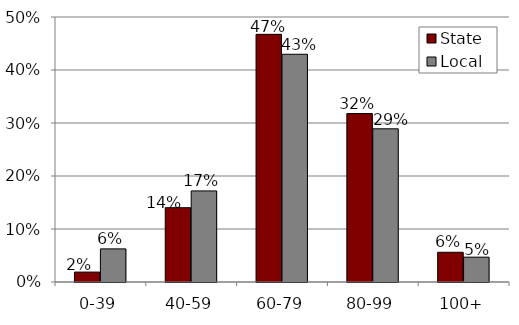
| Category | State | Local |
|---|---|---|
| 0-39 | 0.019 | 0.062 |
| 40-59 | 0.14 | 0.172 |
| 60-79 | 0.467 | 0.43 |
| 80-99 | 0.318 | 0.289 |
| 100+ | 0.056 | 0.047 |